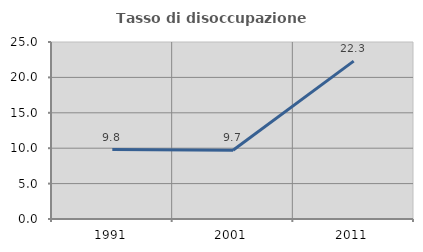
| Category | Tasso di disoccupazione giovanile  |
|---|---|
| 1991.0 | 9.816 |
| 2001.0 | 9.714 |
| 2011.0 | 22.297 |